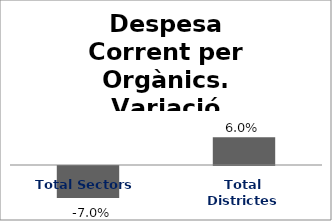
| Category | Series 0 |
|---|---|
| Total Sectors | -0.07 |
| Total Districtes | 0.06 |